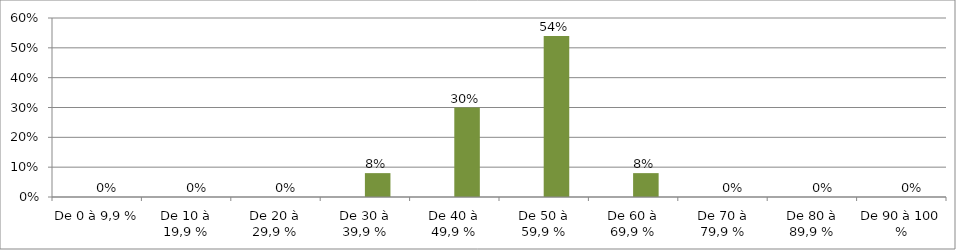
| Category | Series 0 | Series 1 |
|---|---|---|
| De 0 à 9,9 % |  | 0 |
| De 10 à 19,9 % |  | 0 |
| De 20 à 29,9 % |  | 0 |
| De 30 à 39,9 % |  | 0.08 |
| De 40 à 49,9 % |  | 0.3 |
| De 50 à 59,9 % |  | 0.54 |
| De 60 à 69,9 % |  | 0.08 |
| De 70 à 79,9 % |  | 0 |
| De 80 à 89,9 % |  | 0 |
| De 90 à 100 % |  | 0 |